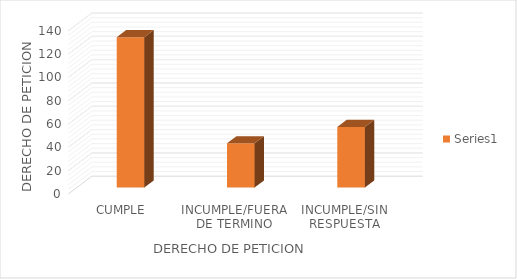
| Category | Series 0 |
|---|---|
| CUMPLE | 129 |
| INCUMPLE/FUERA DE TERMINO | 38 |
| INCUMPLE/SIN RESPUESTA | 52 |